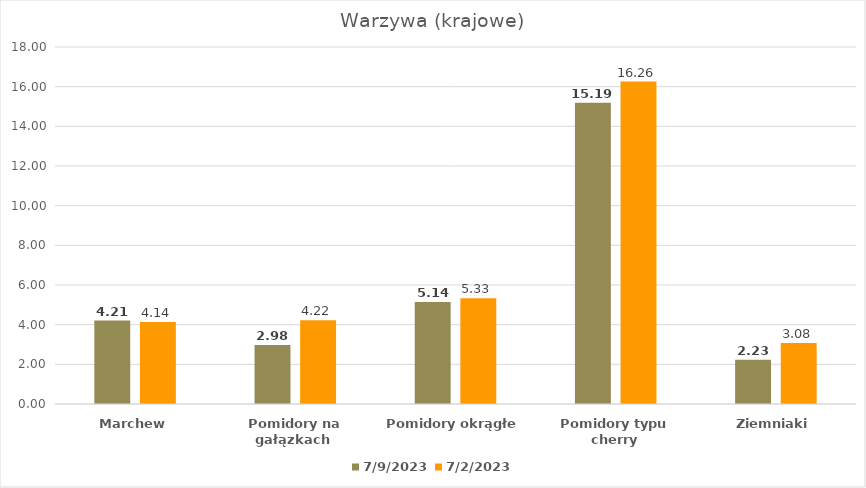
| Category | 09.07.2023 | 02.07.2023 |
|---|---|---|
| Marchew | 4.21 | 4.14 |
| Pomidory na gałązkach  | 2.98 | 4.22 |
| Pomidory okrągłe | 5.14 | 5.33 |
| Pomidory typu cherry | 15.19 | 16.26 |
| Ziemniaki | 2.23 | 3.08 |